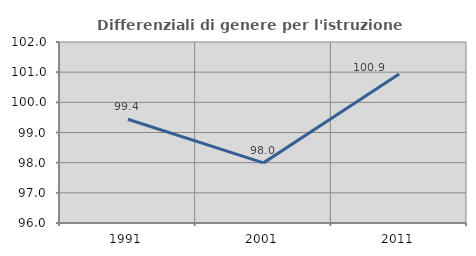
| Category | Differenziali di genere per l'istruzione superiore |
|---|---|
| 1991.0 | 99.441 |
| 2001.0 | 97.993 |
| 2011.0 | 100.936 |